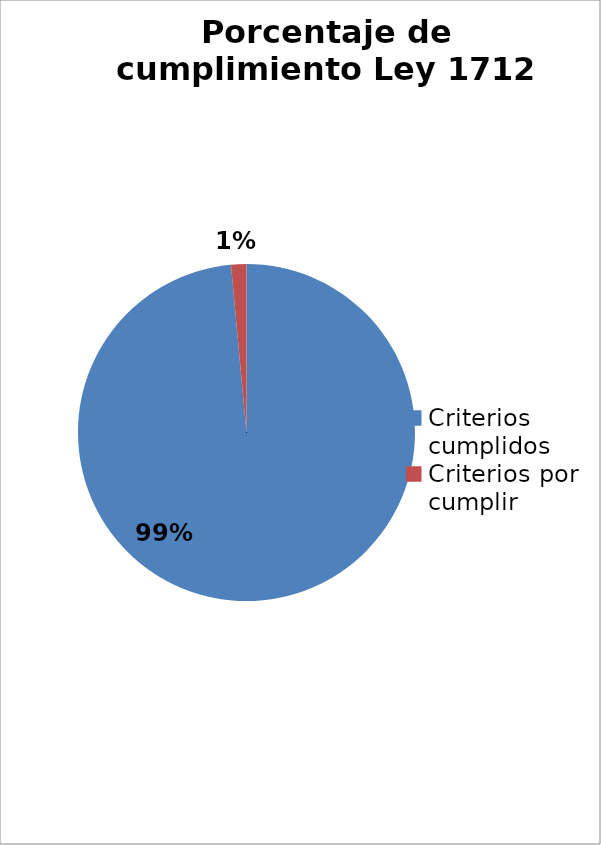
| Category | Series 0 |
|---|---|
| Criterios cumplidos | 134 |
| Criterios por cumplir | 2 |